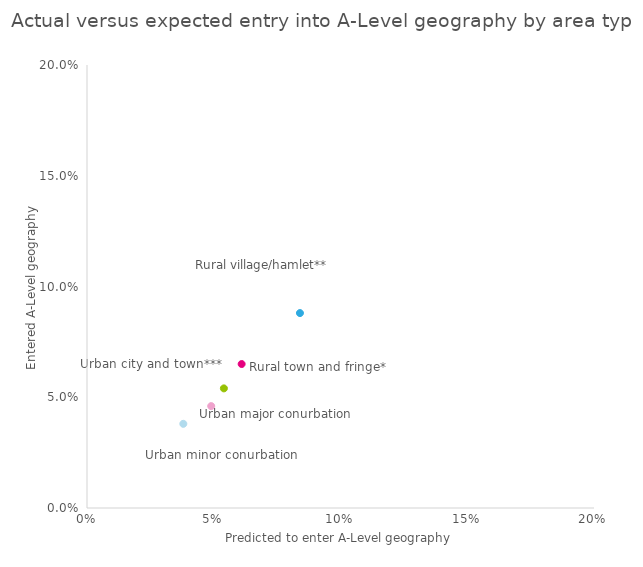
| Category | Series 0 |
|---|---|
| 0.061 | 0.065 |
| 0.084 | 0.088 |
| 0.054 | 0.054 |
| 0.049 | 0.046 |
| 0.038 | 0.038 |